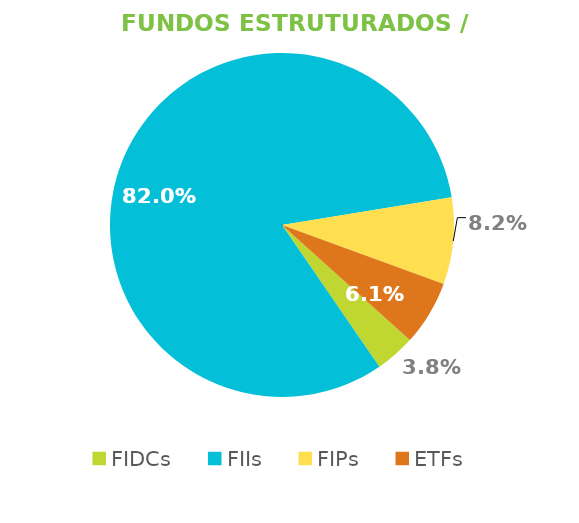
| Category | Fundos Estruturados / ETFs |
|---|---|
| FIDCs | 0.038 |
| FIIs | 0.82 |
| FIPs | 0.082 |
| ETFs | 0.061 |